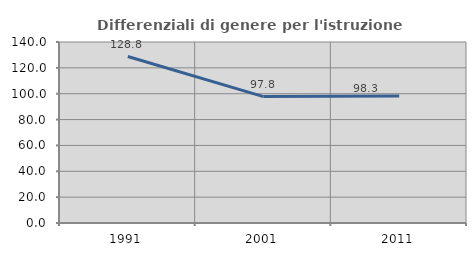
| Category | Differenziali di genere per l'istruzione superiore |
|---|---|
| 1991.0 | 128.765 |
| 2001.0 | 97.761 |
| 2011.0 | 98.311 |